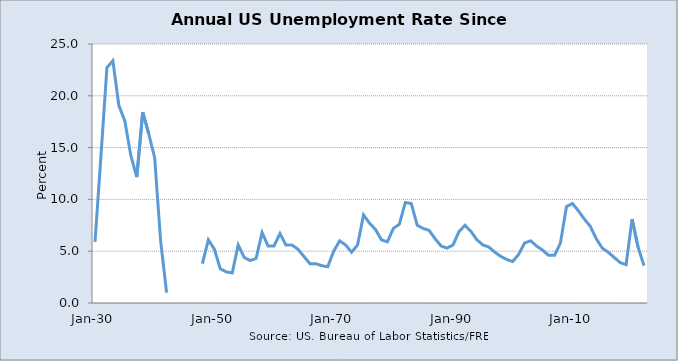
| Category | Series 0 |
|---|---|
| 1930-01-01 | 5.9 |
| 1931-01-01 | 14.2 |
| 1932-01-01 | 22.72 |
| 1933-01-01 | 23.39 |
| 1934-01-01 | 19.06 |
| 1935-01-01 | 17.58 |
| 1936-01-01 | 14.24 |
| 1937-01-01 | 12.16 |
| 1938-01-01 | 18.42 |
| 1939-01-01 | 16.35 |
| 1940-01-01 | 14.02 |
| 1941-01-01 | 6 |
| 1942-01-01 | 1 |
| 1948-01-01 | 3.8 |
| 1949-01-01 | 6.1 |
| 1950-01-01 | 5.2 |
| 1951-01-01 | 3.3 |
| 1952-01-01 | 3 |
| 1953-01-01 | 2.9 |
| 1954-01-01 | 5.6 |
| 1955-01-01 | 4.4 |
| 1956-01-01 | 4.1 |
| 1957-01-01 | 4.3 |
| 1958-01-01 | 6.8 |
| 1959-01-01 | 5.5 |
| 1960-01-01 | 5.5 |
| 1961-01-01 | 6.7 |
| 1962-01-01 | 5.6 |
| 1963-01-01 | 5.6 |
| 1964-01-01 | 5.2 |
| 1965-01-01 | 4.5 |
| 1966-01-01 | 3.8 |
| 1967-01-01 | 3.8 |
| 1968-01-01 | 3.6 |
| 1969-01-01 | 3.5 |
| 1970-01-01 | 5 |
| 1971-01-01 | 6 |
| 1972-01-01 | 5.6 |
| 1973-01-01 | 4.9 |
| 1974-01-01 | 5.6 |
| 1975-01-01 | 8.5 |
| 1976-01-01 | 7.7 |
| 1977-01-01 | 7.1 |
| 1978-01-01 | 6.1 |
| 1979-01-01 | 5.9 |
| 1980-01-01 | 7.2 |
| 1981-01-01 | 7.6 |
| 1982-01-01 | 9.7 |
| 1983-01-01 | 9.6 |
| 1984-01-01 | 7.5 |
| 1985-01-01 | 7.2 |
| 1986-01-01 | 7 |
| 1987-01-01 | 6.2 |
| 1988-01-01 | 5.5 |
| 1989-01-01 | 5.3 |
| 1990-01-01 | 5.6 |
| 1991-01-01 | 6.9 |
| 1992-01-01 | 7.5 |
| 1993-01-01 | 6.9 |
| 1994-01-01 | 6.1 |
| 1995-01-01 | 5.6 |
| 1996-01-01 | 5.4 |
| 1997-01-01 | 4.9 |
| 1998-01-01 | 4.5 |
| 1999-01-01 | 4.2 |
| 2000-01-01 | 4 |
| 2001-01-01 | 4.7 |
| 2002-01-01 | 5.8 |
| 2003-01-01 | 6 |
| 2004-01-01 | 5.5 |
| 2005-01-01 | 5.1 |
| 2006-01-01 | 4.6 |
| 2007-01-01 | 4.6 |
| 2008-01-01 | 5.8 |
| 2009-01-01 | 9.3 |
| 2010-01-01 | 9.6 |
| 2011-01-01 | 8.9 |
| 2012-01-01 | 8.1 |
| 2013-01-01 | 7.4 |
| 2014-01-01 | 6.2 |
| 2015-01-01 | 5.3 |
| 2016-01-01 | 4.9 |
| 2017-01-01 | 4.4 |
| 2018-01-01 | 3.9 |
| 2019-01-01 | 3.7 |
| 2020-01-01 | 8.1 |
| 2021-01-01 | 5.4 |
| 2022-01-01 | 3.6 |